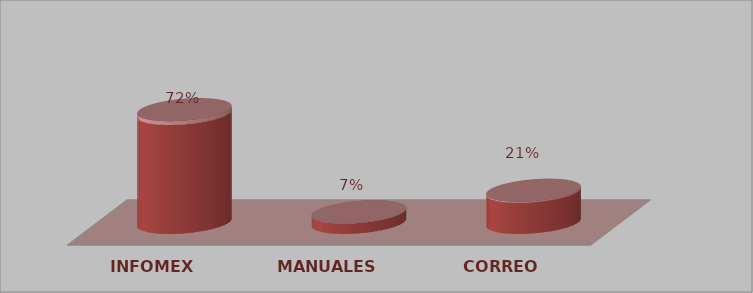
| Category | Series 0 | Series 1 |
|---|---|---|
| INFOMEX | 21 | 0.724 |
| MANUALES | 2 | 0.069 |
| CORREO | 6 | 0.207 |